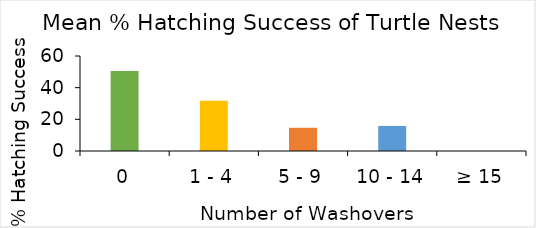
| Category | % Hatching success |
|---|---|
| ≥ 15 | 0 |
| 10 - 14 | 15.823 |
| 5 - 9 | 14.663 |
| 1 - 4 | 31.699 |
| 0 | 50.53 |